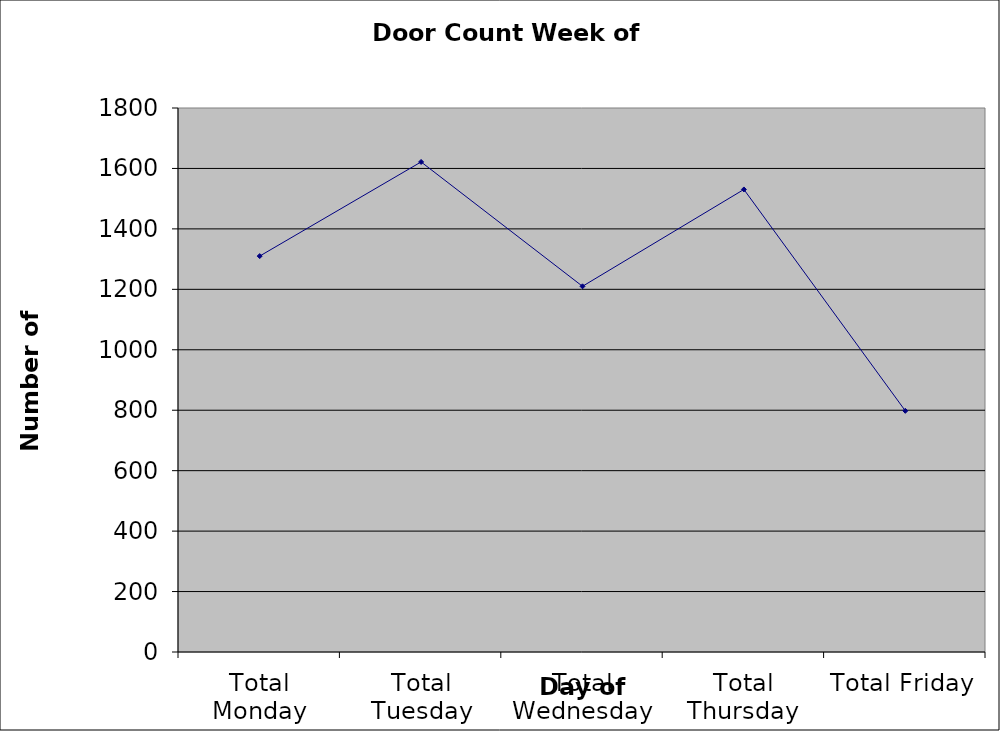
| Category | Series 0 |
|---|---|
| Total Monday | 1310 |
| Total Tuesday | 1621.5 |
| Total Wednesday | 1210 |
| Total Thursday | 1530.5 |
| Total Friday | 798 |